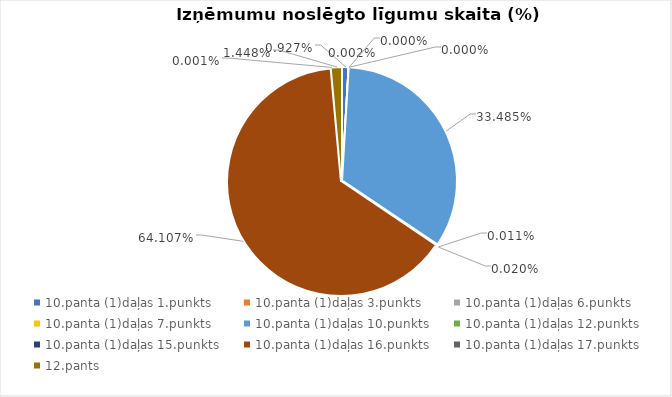
| Category | Īpatsvars (%) |
|---|---|
| 10.panta (1)daļas 1.punkts | 0.009 |
| 10.panta (1)daļas 3.punkts | 0 |
| 10.panta (1)daļas 6.punkts | 0 |
| 10.panta (1)daļas 7.punkts | 0 |
| 10.panta (1)daļas 10.punkts | 0.335 |
| 10.panta (1)daļas 12.punkts | 0 |
| 10.panta (1)daļas 15.punkts | 0 |
| 10.panta (1)daļas 16.punkts | 0.641 |
| 10.panta (1)daļas 17.punkts | 0 |
| 12.pants | 0.014 |